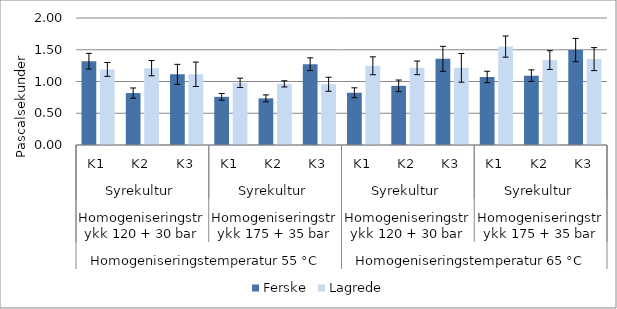
| Category | Ferske | Lagrede |
|---|---|---|
| 0 | 1.32 | 1.19 |
| 1 | 0.818 | 1.21 |
| 2 | 1.112 | 1.113 |
| 3 | 0.758 | 0.979 |
| 4 | 0.735 | 0.963 |
| 5 | 1.272 | 0.957 |
| 6 | 0.823 | 1.248 |
| 7 | 0.932 | 1.215 |
| 8 | 1.358 | 1.215 |
| 9 | 1.072 | 1.55 |
| 10 | 1.092 | 1.338 |
| 11 | 1.495 | 1.352 |